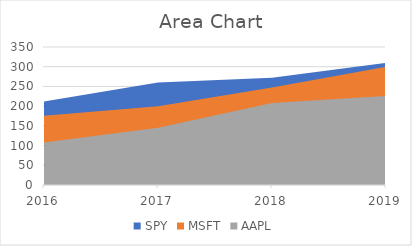
| Category | SPY | MSFT | AAPL |
|---|---|---|---|
| 2016.0 | 212 | 175.65 | 108 |
| 2017.0 | 260 | 200 | 145 |
| 2018.0 | 272 | 247 | 208 |
| 2019.0 | 310 | 300 | 226 |